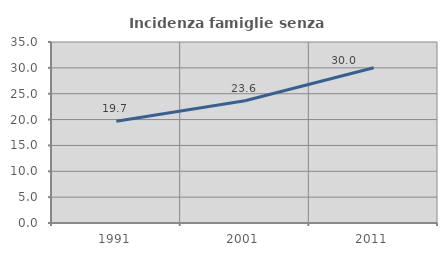
| Category | Incidenza famiglie senza nuclei |
|---|---|
| 1991.0 | 19.663 |
| 2001.0 | 23.631 |
| 2011.0 | 30.013 |